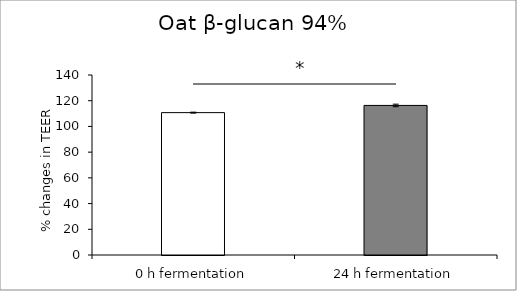
| Category | average |
|---|---|
| 0 h fermentation | 110.728 |
| 24 h fermentation | 116.327 |